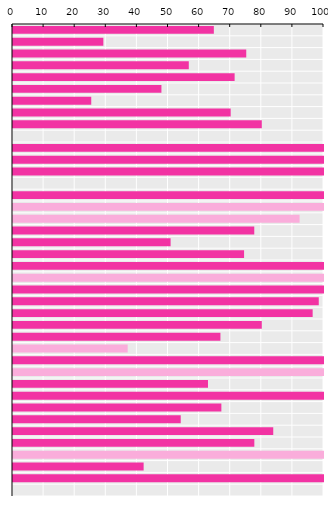
| Category | Payment rate (%) |
|---|---|
| Greece | 64.58 |
| United Kingdom | 29.051 |
| Slovak Republic | 75 |
| Czech Republic | 56.525 |
| Iceland | 71.263 |
| New Zealand | 47.725 |
| Ireland | 25.16 |
| Hungary | 70 |
| Italy | 80 |
| EU average | 0 |
| Estonia | 100 |
| Luxembourg | 100 |
| Poland | 100 |
| OECD | 0 |
| Chile | 100 |
| Colombia | 100 |
| Norway | 92.151 |
| Lithuania | 77.58 |
| Denmark | 50.68 |
| Finland | 74.3 |
| Costa Rica | 100 |
| Spain | 100 |
| Austria | 100 |
| Netherlands | 98.317 |
| France | 96.352 |
| Latvia | 80 |
| Türkiye | 66.7 |
| Canada | 36.873 |
| Israel | 100 |
| Slovenia | 100 |
| Belgium | 62.695 |
| Germany | 100 |
| Japan | 67 |
| Switzerland | 53.932 |
| Korea | 83.68 |
| Sweden | 77.6 |
| Mexico | 100 |
| Australia | 42.006 |
| Portugal | 100 |
| United States | 0 |